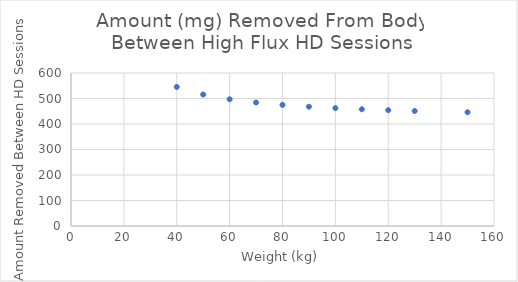
| Category | Series 0 |
|---|---|
| 40.0 | 545.437 |
| 50.0 | 515.719 |
| 60.0 | 497.059 |
| 70.0 | 484.263 |
| 80.0 | 474.945 |
| 90.0 | 467.86 |
| 100.0 | 462.291 |
| 110.0 | 457.799 |
| 120.0 | 454.099 |
| 130.0 | 450.999 |
| 150.0 | 446.097 |